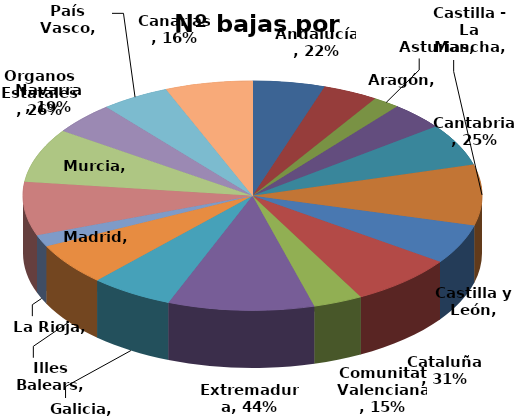
| Category | Nº bajas por enfermedad |
|---|---|
| Andalucía | 0.216 |
| Aragón | 0.164 |
| Asturias | 0.08 |
| Canarias | 0.164 |
| Cantabria | 0.25 |
| Castilla - La Mancha | 0.364 |
| Castilla y León | 0.238 |
| Cataluña | 0.314 |
| Comunitat Valenciana | 0.147 |
| Extremadura | 0.436 |
| Galicia | 0.248 |
| Illes Balears | 0.25 |
| La Rioja | 0.071 |
| Madrid | 0.319 |
| Murcia | 0.323 |
| Navarra | 0.19 |
| País Vasco | 0.204 |
| Organos Estatales | 0.26 |